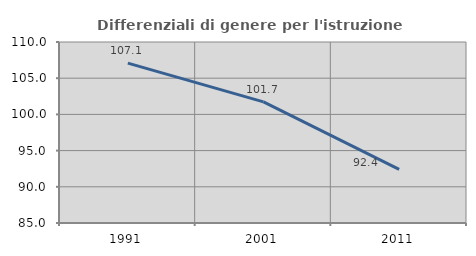
| Category | Differenziali di genere per l'istruzione superiore |
|---|---|
| 1991.0 | 107.085 |
| 2001.0 | 101.729 |
| 2011.0 | 92.394 |